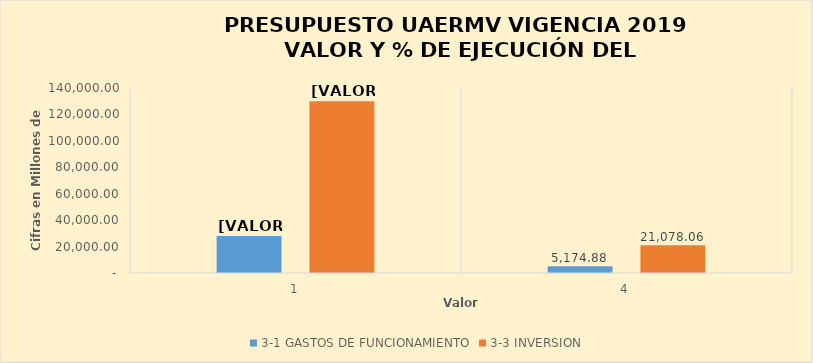
| Category | 3-1 | 3-3 |
|---|---|---|
| 0 | 28072.61 | 129977.394 |
| 1 | 5174.885 | 21078.055 |